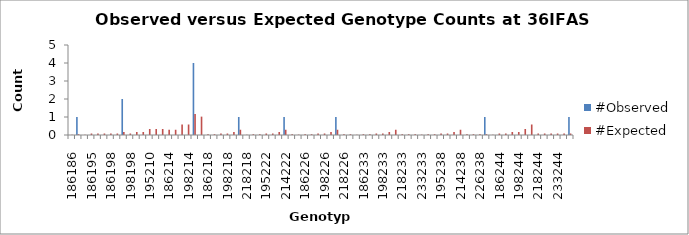
| Category | #Observed | #Expected |
|---|---|---|
| 186186.0 | 0 | 0.021 |
| 186190.0 | 1 | 0.042 |
| 190190.0 | 0 | 0.021 |
| 186195.0 | 0 | 0.083 |
| 190195.0 | 0 | 0.083 |
| 195195.0 | 0 | 0.083 |
| 186198.0 | 0 | 0.083 |
| 190198.0 | 0 | 0.083 |
| 195198.0 | 2 | 0.167 |
| 198198.0 | 0 | 0.083 |
| 186210.0 | 0 | 0.167 |
| 190210.0 | 0 | 0.167 |
| 195210.0 | 0 | 0.333 |
| 198210.0 | 0 | 0.333 |
| 210210.0 | 0 | 0.333 |
| 186214.0 | 0 | 0.292 |
| 190214.0 | 0 | 0.292 |
| 195214.0 | 0 | 0.583 |
| 198214.0 | 0 | 0.583 |
| 210214.0 | 4 | 1.167 |
| 214214.0 | 0 | 1.021 |
| 186218.0 | 0 | 0.042 |
| 190218.0 | 0 | 0.042 |
| 195218.0 | 0 | 0.083 |
| 198218.0 | 0 | 0.083 |
| 210218.0 | 0 | 0.167 |
| 214218.0 | 1 | 0.292 |
| 218218.0 | 0 | 0.021 |
| 186222.0 | 0 | 0.042 |
| 190222.0 | 0 | 0.042 |
| 195222.0 | 0 | 0.083 |
| 198222.0 | 0 | 0.083 |
| 210222.0 | 0 | 0.167 |
| 214222.0 | 1 | 0.292 |
| 218222.0 | 0 | 0.042 |
| 222222.0 | 0 | 0.021 |
| 186226.0 | 0 | 0.042 |
| 190226.0 | 0 | 0.042 |
| 195226.0 | 0 | 0.083 |
| 198226.0 | 0 | 0.083 |
| 210226.0 | 0 | 0.167 |
| 214226.0 | 1 | 0.292 |
| 218226.0 | 0 | 0.042 |
| 222226.0 | 0 | 0.042 |
| 226226.0 | 0 | 0.021 |
| 186233.0 | 0 | 0.042 |
| 190233.0 | 0 | 0.042 |
| 195233.0 | 0 | 0.083 |
| 198233.0 | 0 | 0.083 |
| 210233.0 | 0 | 0.167 |
| 214233.0 | 0 | 0.292 |
| 218233.0 | 0 | 0.042 |
| 222233.0 | 0 | 0.042 |
| 226233.0 | 0 | 0.042 |
| 233233.0 | 0 | 0.021 |
| 186238.0 | 0 | 0.042 |
| 190238.0 | 0 | 0.042 |
| 195238.0 | 0 | 0.083 |
| 198238.0 | 0 | 0.083 |
| 210238.0 | 0 | 0.167 |
| 214238.0 | 0 | 0.292 |
| 218238.0 | 0 | 0.042 |
| 222238.0 | 0 | 0.042 |
| 226238.0 | 0 | 0.042 |
| 233238.0 | 1 | 0.042 |
| 238238.0 | 0 | 0.021 |
| 186244.0 | 0 | 0.083 |
| 190244.0 | 0 | 0.083 |
| 195244.0 | 0 | 0.167 |
| 198244.0 | 0 | 0.167 |
| 210244.0 | 0 | 0.333 |
| 214244.0 | 0 | 0.583 |
| 218244.0 | 0 | 0.083 |
| 222244.0 | 0 | 0.083 |
| 226244.0 | 0 | 0.083 |
| 233244.0 | 0 | 0.083 |
| 238244.0 | 0 | 0.083 |
| 244244.0 | 1 | 0.083 |